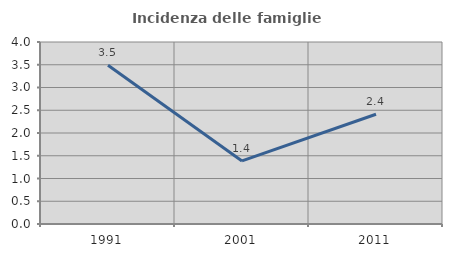
| Category | Incidenza delle famiglie numerose |
|---|---|
| 1991.0 | 3.489 |
| 2001.0 | 1.386 |
| 2011.0 | 2.413 |